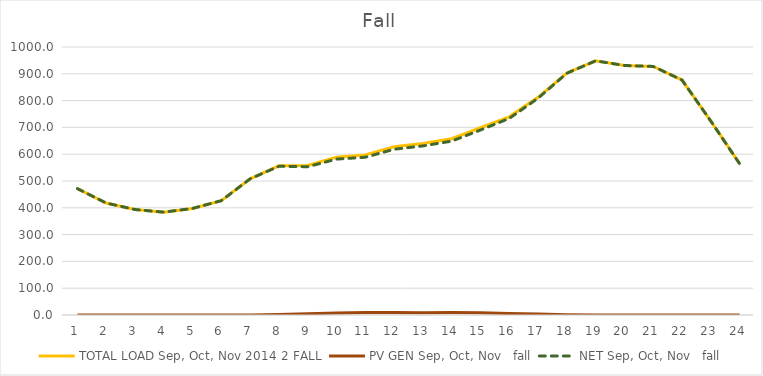
| Category | TOTAL LOAD | PV GEN | NET |
|---|---|---|---|
| 0 | 471.452 | 0 | 471.452 |
| 1 | 417.757 | 0 | 417.757 |
| 2 | 393.552 | 0 | 393.552 |
| 3 | 383.798 | 0 | 383.798 |
| 4 | 397.756 | 0 | 397.756 |
| 5 | 426.598 | 0 | 426.598 |
| 6 | 508.196 | 0.005 | 508.191 |
| 7 | 556.564 | 1.64 | 554.924 |
| 8 | 558.216 | 4.879 | 553.337 |
| 9 | 589.015 | 7.348 | 581.666 |
| 10 | 597.477 | 8.868 | 588.61 |
| 11 | 627.453 | 8.957 | 618.497 |
| 12 | 639.668 | 8.817 | 630.851 |
| 13 | 657.746 | 8.961 | 648.786 |
| 14 | 698.665 | 8.39 | 690.275 |
| 15 | 739.372 | 5.938 | 733.434 |
| 16 | 812.253 | 3.346 | 808.907 |
| 17 | 902.858 | 0.765 | 902.093 |
| 18 | 948.354 | 0.001 | 948.353 |
| 19 | 931.019 | 0 | 931.019 |
| 20 | 927.461 | 0 | 927.461 |
| 21 | 876.739 | 0 | 876.739 |
| 22 | 723.527 | 0 | 723.527 |
| 23 | 564.543 | 0 | 564.543 |